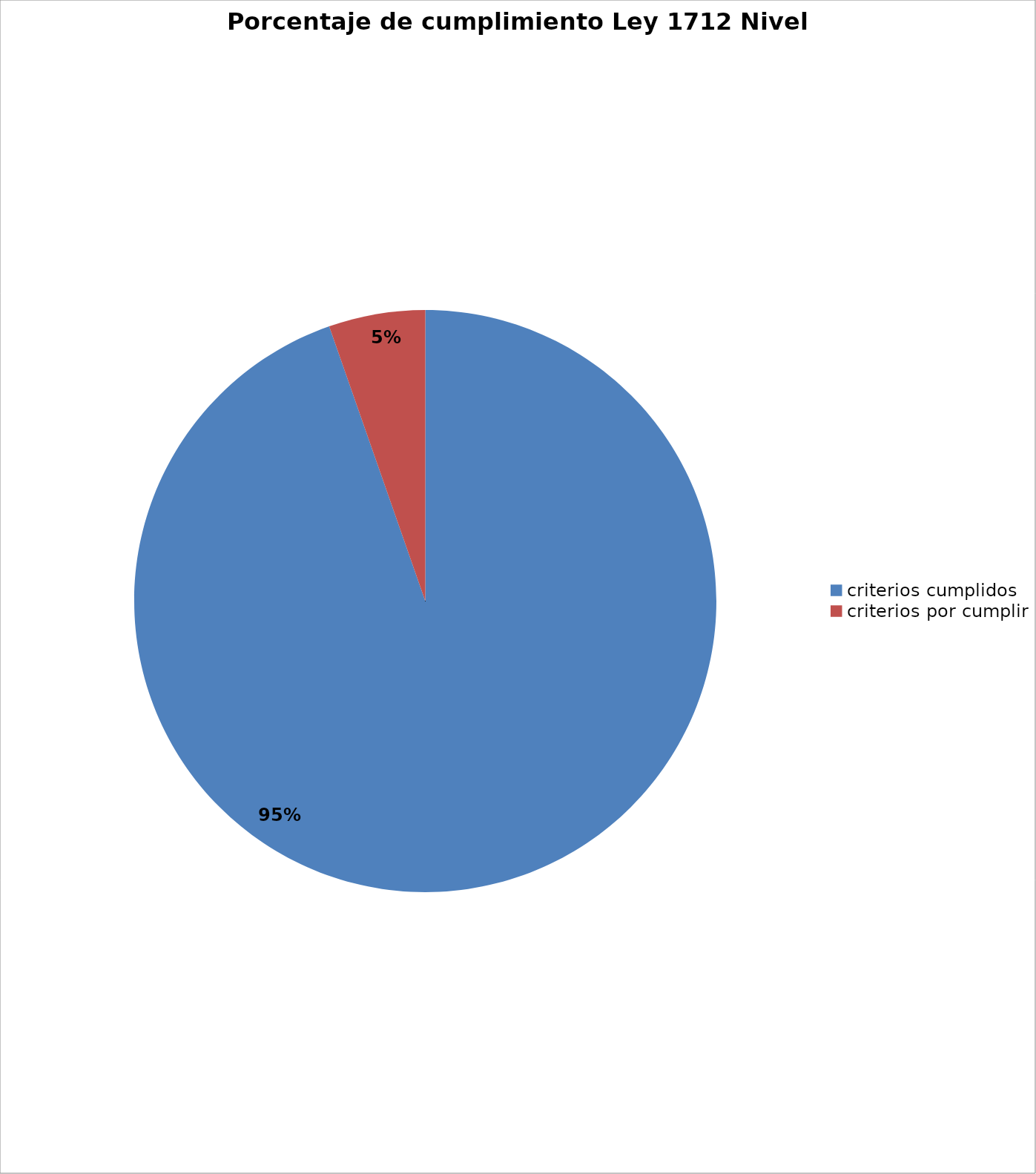
| Category | Series 0 |
|---|---|
| criterios cumplidos | 159 |
| criterios por cumplir | 9 |